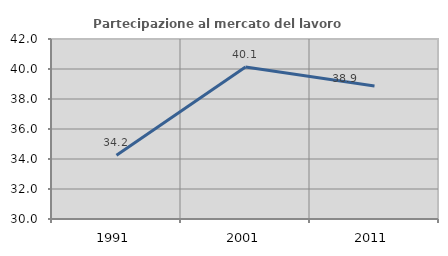
| Category | Partecipazione al mercato del lavoro  femminile |
|---|---|
| 1991.0 | 34.247 |
| 2001.0 | 40.136 |
| 2011.0 | 38.871 |